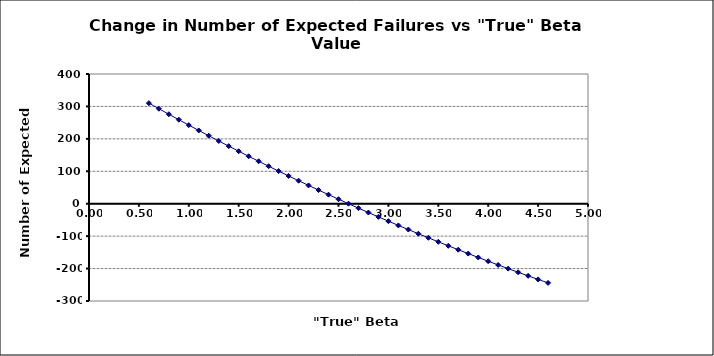
| Category | Series 0 |
|---|---|
| 0.6000000000000001 | 310.136 |
| 0.7000000000000001 | 292.923 |
| 0.8 | 275.896 |
| 0.9 | 259.052 |
| 1.0 | 242.392 |
| 1.1 | 225.915 |
| 1.2000000000000002 | 209.62 |
| 1.3000000000000003 | 193.505 |
| 1.4000000000000004 | 177.571 |
| 1.5000000000000004 | 161.815 |
| 1.6000000000000005 | 146.237 |
| 1.7000000000000006 | 130.836 |
| 1.8000000000000007 | 115.611 |
| 1.9000000000000008 | 100.56 |
| 2.000000000000001 | 85.683 |
| 2.100000000000001 | 70.978 |
| 2.200000000000001 | 56.445 |
| 2.300000000000001 | 42.081 |
| 2.4000000000000012 | 27.887 |
| 2.5000000000000013 | 13.86 |
| 2.6000000000000014 | 0 |
| 2.7000000000000015 | -13.695 |
| 2.8000000000000016 | -27.226 |
| 2.9000000000000017 | -40.595 |
| 3.0000000000000018 | -53.802 |
| 3.100000000000002 | -66.849 |
| 3.200000000000002 | -79.737 |
| 3.300000000000002 | -92.467 |
| 3.400000000000002 | -105.042 |
| 3.500000000000002 | -117.461 |
| 3.6000000000000023 | -129.728 |
| 3.7000000000000024 | -141.841 |
| 3.8000000000000025 | -153.805 |
| 3.9000000000000026 | -165.618 |
| 4.000000000000003 | -177.284 |
| 4.100000000000002 | -188.802 |
| 4.200000000000002 | -200.176 |
| 4.300000000000002 | -211.405 |
| 4.400000000000001 | -222.491 |
| 4.500000000000001 | -233.437 |
| 4.6000000000000005 | -244.242 |